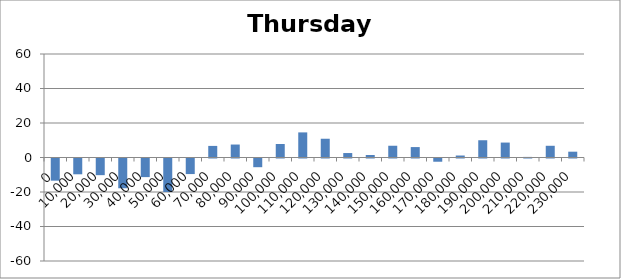
| Category | Thursday 60 |
|---|---|
| 0.0 | -12.852 |
| 10000.0 | -9.152 |
| 20000.0 | -9.652 |
| 30000.0 | -17.257 |
| 40000.0 | -10.79 |
| 50000.0 | -19.41 |
| 60000.0 | -9.024 |
| 70000.0 | 6.719 |
| 80000.0 | 7.519 |
| 90000.0 | -5.043 |
| 100000.0 | 7.814 |
| 110000.0 | 14.552 |
| 120000.0 | 10.876 |
| 130000.0 | 2.586 |
| 140000.0 | 1.443 |
| 150000.0 | 6.814 |
| 160000.0 | 6.043 |
| 170000.0 | -1.871 |
| 180000.0 | 1.148 |
| 190000.0 | 10 |
| 200000.0 | 8.657 |
| 210000.0 | 0.343 |
| 220000.0 | 6.793 |
| 230000.0 | 3.37 |